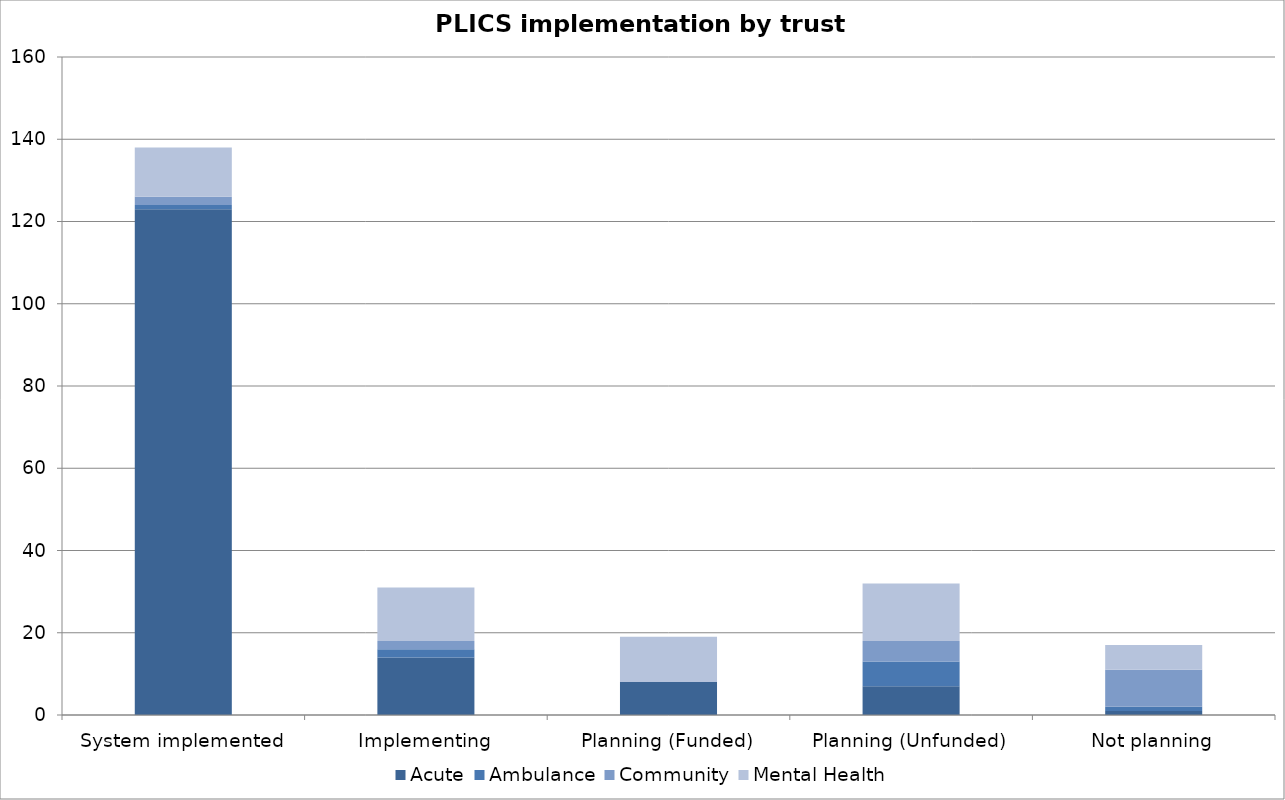
| Category | Acute | Ambulance | Community | Mental Health |
|---|---|---|---|---|
| System implemented | 123 | 1 | 2 | 12 |
| Implementing | 14 | 2 | 2 | 13 |
| Planning (Funded) | 8 | 0 | 0 | 11 |
| Planning (Unfunded) | 7 | 6 | 5 | 14 |
| Not planning | 1 | 1 | 9 | 6 |